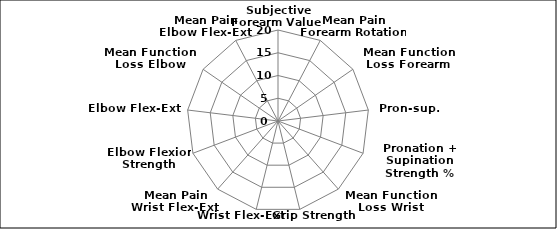
| Category | Series 0 |
|---|---|
| Subjective Forearm Value  | 0 |
| Mean Pain Forearm Rotation | 0 |
| Mean Function Loss Forearm Rotation | 0 |
| Pron-sup. Arc° | 0 |
| Pronation + Supination Strength % | 0 |
| Mean Function Loss Wrist Flex-Ext. | 0 |
| Grip Strength % | 0 |
| Wrist Flex-Ext Arc° | 0 |
| Mean Pain Wrist Flex-Ext. | 0 |
| Elbow Flexion Strength (MRC) | 0 |
| Elbow Flex-Ext Arc° | 0 |
| Mean Function Loss Elbow Flex-Ext. | 0 |
| Mean Pain Elbow Flex-Ext. | 0 |